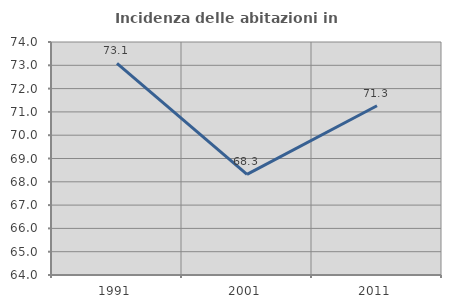
| Category | Incidenza delle abitazioni in proprietà  |
|---|---|
| 1991.0 | 73.084 |
| 2001.0 | 68.32 |
| 2011.0 | 71.264 |